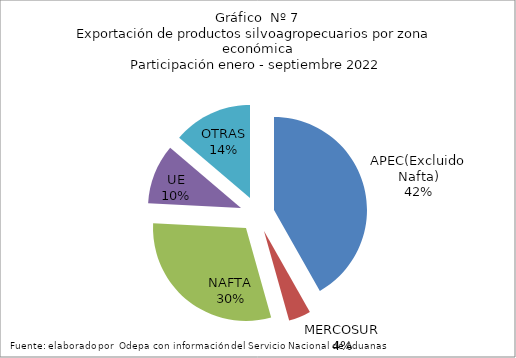
| Category | Series 0 |
|---|---|
| APEC(Excluido Nafta) | 6119906.234 |
| MERCOSUR | 563746.288 |
| NAFTA | 4415797.942 |
| UE | 1526656.838 |
| OTRAS | 2018160.699 |